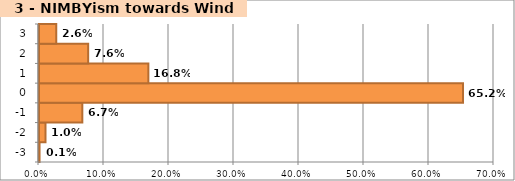
| Category | Series 0 |
|---|---|
| -3.0 | 0.001 |
| -2.0 | 0.01 |
| -1.0 | 0.067 |
| 0.0 | 0.652 |
| 1.0 | 0.168 |
| 2.0 | 0.076 |
| 3.0 | 0.026 |